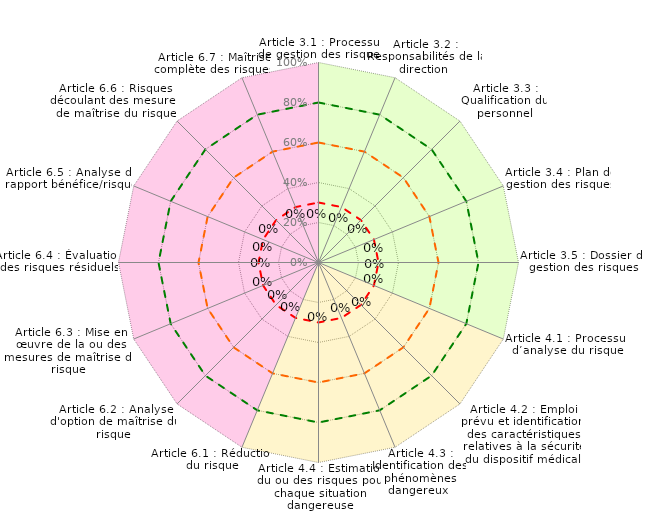
| Category | Coloriage Art 3 | Coloriage Art 4 | Coloriage Art 6 | Conforme | Convaincant | Informel | Résultat |
|---|---|---|---|---|---|---|---|
| Article 3.1 : Processus de gestion des risques | 1 | 0 | 1 | 0.8 | 0.6 | 0.3 | 0 |
| Article 3.2 : Responsabilités de la direction  | 1 | 0 | 0 | 0.8 | 0.6 | 0.3 | 0 |
| Article 3.3 : Qualification du personnel | 1 | 0 | 0 | 0.8 | 0.6 | 0.3 | 0 |
| Article 3.4 : Plan de gestion des risques | 1 | 0 | 0 | 0.8 | 0.6 | 0.3 | 0 |
| Article 3.5 : Dossier de gestion des risques | 1 | 0 | 0 | 0.8 | 0.6 | 0.3 | 0 |
| Article 4.1 : Processus d’analyse du risque | 1 | 1 | 0 | 0.8 | 0.6 | 0.3 | 0 |
| Article 4.2 : Emploi prévu et identification des caractéristiques relatives à la sécurité du dispositif médical | 0 | 1 | 0 | 0.8 | 0.6 | 0.3 | 0 |
| Article 4.3 : Identification des phénomènes dangereux  | 0 | 1 | 0 | 0.8 | 0.6 | 0.3 | 0 |
| Article 4.4 : Estimation du ou des risques pour chaque situation dangereuse | 0 | 1 | 0 | 0.8 | 0.6 | 0.3 | 0 |
| Article 6.1 : Réduction du risque | 0 | 1 | 1 | 0.8 | 0.6 | 0.3 | 0 |
| Article 6.2 : Analyse d'option de maîtrise du risque | 0 | 0 | 1 | 0.8 | 0.6 | 0.3 | 0 |
| Article 6.3 : Mise en œuvre de la ou des mesures de maîtrise du risque | 0 | 0 | 1 | 0.8 | 0.6 | 0.3 | 0 |
| Article 6.4 : Évaluation des risques résiduels | 0 | 0 | 1 | 0.8 | 0.6 | 0.3 | 0 |
| Article 6.5 : Analyse du rapport bénéfice/risque | 0 | 0 | 1 | 0.8 | 0.6 | 0.3 | 0 |
| Article 6.6 : Risques découlant des mesures de maîtrise du risque | 0 | 0 | 1 | 0.8 | 0.6 | 0.3 | 0 |
| Article 6.7 : Maîtrise complète des risques | 0 | 0 | 1 | 0.8 | 0.6 | 0.3 | 0 |